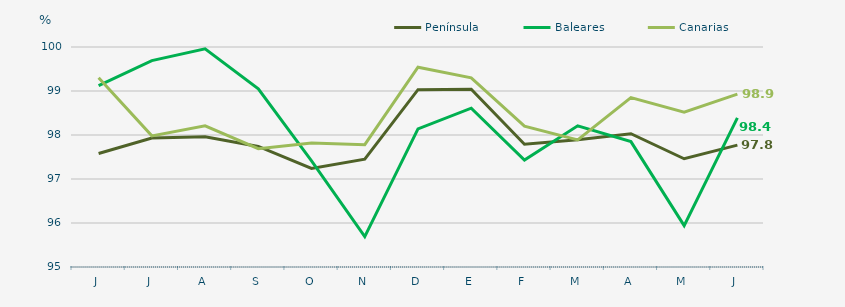
| Category | Península | Baleares | Canarias |
|---|---|---|---|
| J | 97.58 | 99.12 | 99.3 |
| J | 97.93 | 99.69 | 97.98 |
| A | 97.96 | 99.96 | 98.21 |
| S | 97.74 | 99.05 | 97.69 |
| O | 97.24 | 97.41 | 97.82 |
| N | 97.45 | 95.69 | 97.78 |
| D | 99.03 | 98.14 | 99.54 |
| E | 99.04 | 98.61 | 99.3 |
| F | 97.79 | 97.43 | 98.2 |
| M | 97.89 | 98.21 | 97.89 |
| A | 98.03 | 97.85 | 98.85 |
| M | 97.46 | 95.94 | 98.52 |
| J | 97.77 | 98.39 | 98.93 |